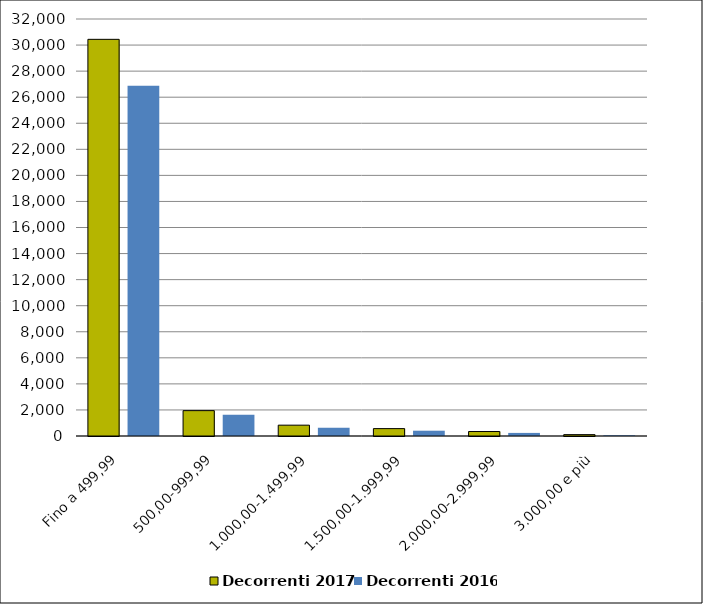
| Category | Decorrenti 2017 | Decorrenti 2016 |
|---|---|---|
| Fino a 499,99 | 30439 | 26872 |
| 500,00-999,99 | 1947 | 1628 |
| 1.000,00-1.499,99 | 832 | 640 |
| 1.500,00-1.999,99 | 566 | 406 |
| 2.000,00-2.999,99 | 344 | 237 |
| 3.000,00 e più | 105 | 55 |